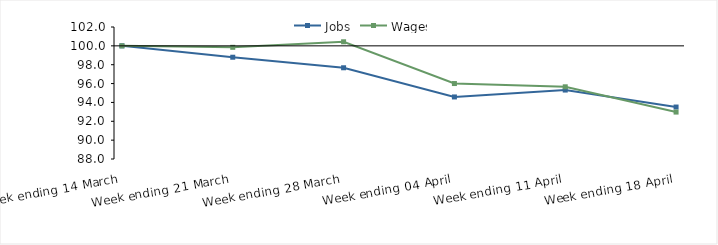
| Category | Jobs | Wages |
|---|---|---|
| 0 | 100 | 100 |
| 1900-01-01 | 98.794 | 99.846 |
| 1900-01-02 | 97.676 | 100.433 |
| 1900-01-03 | 94.581 | 96.003 |
| 1900-01-04 | 95.312 | 95.657 |
| 1900-01-05 | 93.511 | 92.976 |